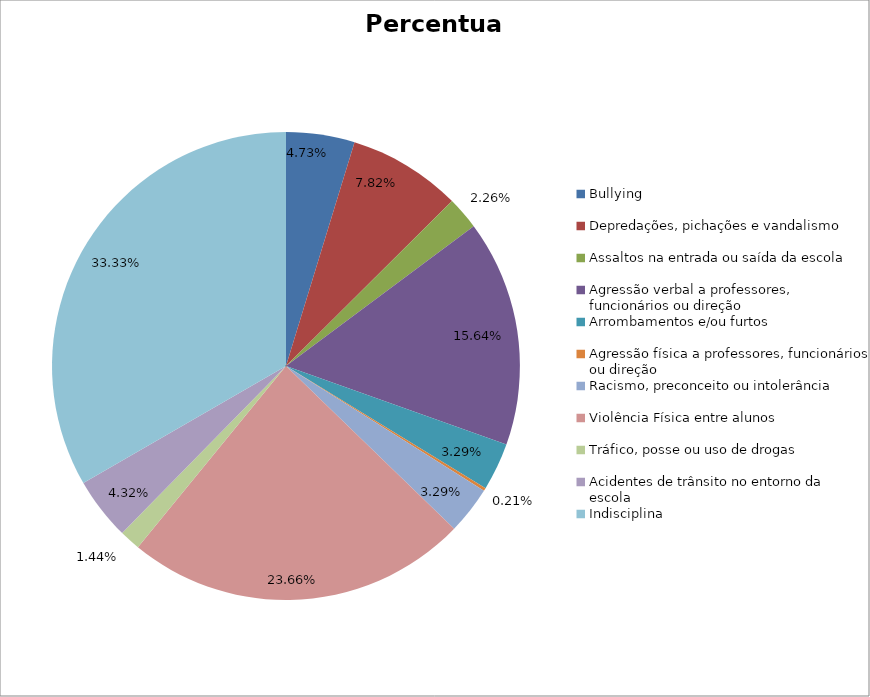
| Category | Percentual |
|---|---|
| Bullying | 0.047 |
| Depredações, pichações e vandalismo | 0.078 |
| Assaltos na entrada ou saída da escola | 0.023 |
| Agressão verbal a professores, funcionários ou direção | 0.156 |
| Arrombamentos e/ou furtos | 0.033 |
| Agressão física a professores, funcionários ou direção | 0.002 |
| Racismo, preconceito ou intolerância | 0.033 |
| Violência Física entre alunos | 0.237 |
| Tráfico, posse ou uso de drogas | 0.014 |
| Acidentes de trânsito no entorno da escola | 0.043 |
| Indisciplina | 0.333 |